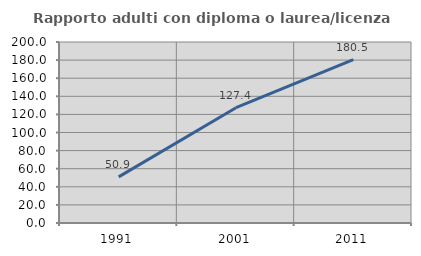
| Category | Rapporto adulti con diploma o laurea/licenza media  |
|---|---|
| 1991.0 | 50.926 |
| 2001.0 | 127.381 |
| 2011.0 | 180.519 |